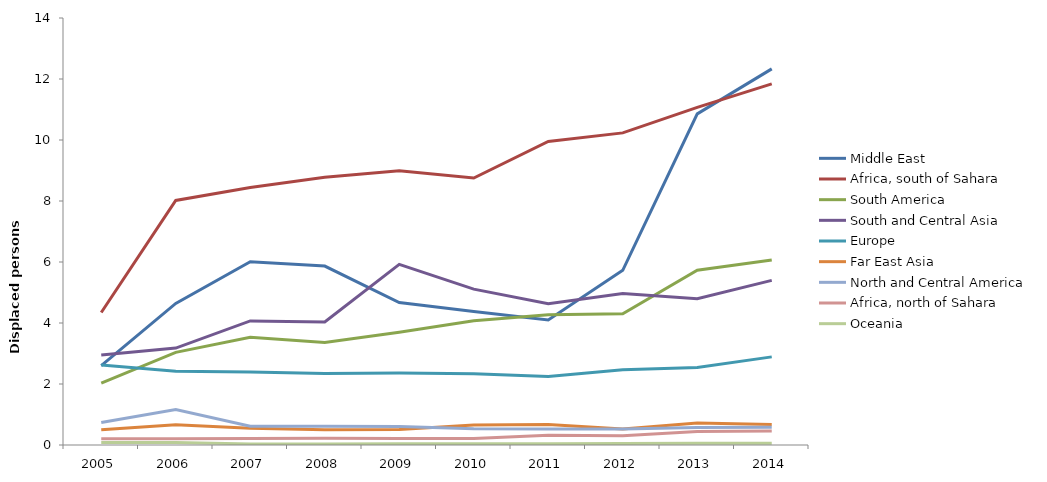
| Category | Middle East | Africa, south of Sahara | South America | South and Central Asia | Europe | Far East Asia | North and Central America | Africa, north of Sahara | Oceania |
|---|---|---|---|---|---|---|---|---|---|
| 2005.0 | 2.602 | 4.343 | 2.029 | 2.95 | 2.625 | 0.504 | 0.736 | 0.209 | 0.082 |
| 2006.0 | 4.64 | 8.018 | 3.038 | 3.179 | 2.418 | 0.666 | 1.162 | 0.206 | 0.086 |
| 2007.0 | 6.009 | 8.443 | 3.533 | 4.069 | 2.396 | 0.552 | 0.617 | 0.217 | 0.037 |
| 2008.0 | 5.868 | 8.782 | 3.362 | 4.034 | 2.341 | 0.499 | 0.615 | 0.22 | 0.036 |
| 2009.0 | 4.672 | 8.99 | 3.7 | 5.922 | 2.361 | 0.505 | 0.61 | 0.216 | 0.038 |
| 2010.0 | 4.377 | 8.752 | 4.075 | 5.109 | 2.335 | 0.653 | 0.53 | 0.216 | 0.038 |
| 2011.0 | 4.102 | 9.954 | 4.272 | 4.633 | 2.249 | 0.675 | 0.527 | 0.322 | 0.04 |
| 2012.0 | 5.727 | 10.233 | 4.303 | 4.968 | 2.469 | 0.522 | 0.521 | 0.3 | 0.053 |
| 2013.0 | 10.857 | 11.072 | 5.728 | 4.792 | 2.543 | 0.725 | 0.575 | 0.441 | 0.06 |
| 2014.0 | 12.332 | 11.842 | 6.063 | 5.397 | 2.889 | 0.67 | 0.585 | 0.462 | 0.061 |